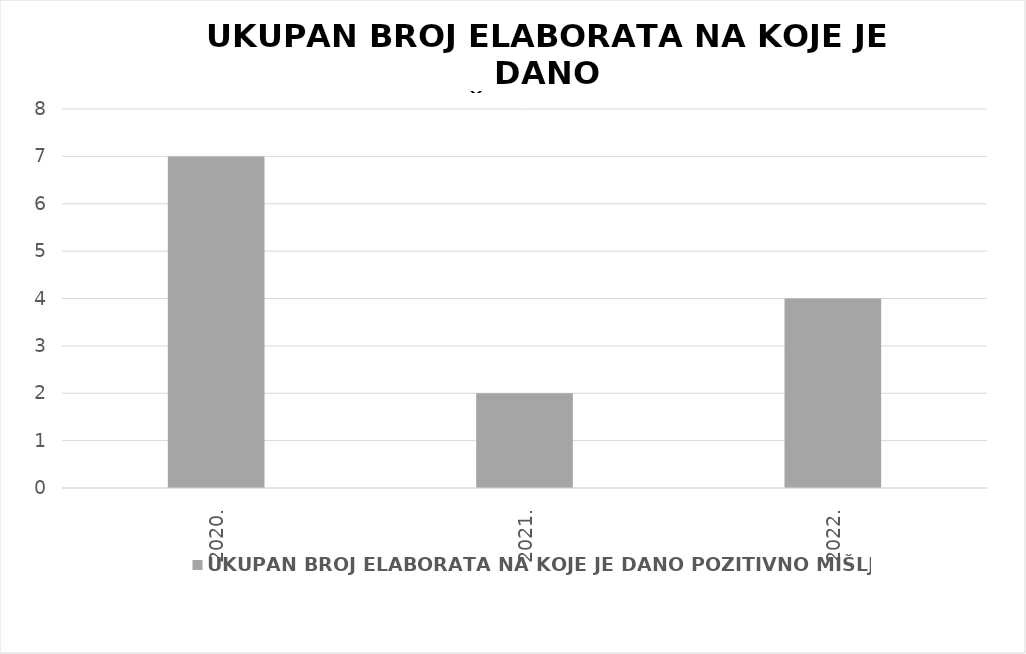
| Category | UKUPAN BROJ ELABORATA NA KOJE JE DANO POZITIVNO MIŠLJENJE |
|---|---|
| 2020. | 7 |
| 2021. | 2 |
| 2022. | 4 |